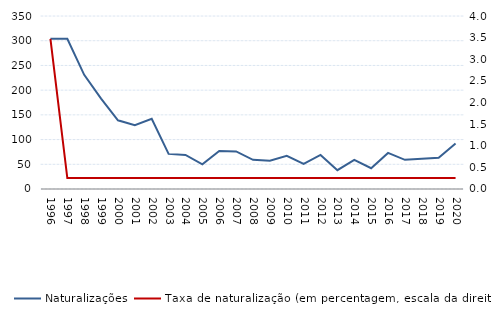
| Category | Naturalizações |
|---|---|
| 1996.0 | 304 |
| 1997.0 | 304 |
| 1998.0 | 231 |
| 1999.0 | 183 |
| 2000.0 | 139 |
| 2001.0 | 129 |
| 2002.0 | 142 |
| 2003.0 | 71 |
| 2004.0 | 69 |
| 2005.0 | 50 |
| 2006.0 | 77 |
| 2007.0 | 76 |
| 2008.0 | 59 |
| 2009.0 | 57 |
| 2010.0 | 67 |
| 2011.0 | 51 |
| 2012.0 | 69 |
| 2013.0 | 38 |
| 2014.0 | 59 |
| 2015.0 | 42 |
| 2016.0 | 73 |
| 2017.0 | 59 |
| 2018.0 | 61 |
| 2019.0 | 63 |
| 2020.0 | 92 |